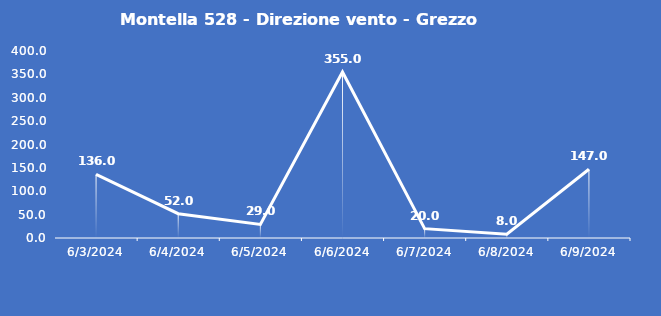
| Category | Montella 528 - Direzione vento - Grezzo (°N) |
|---|---|
| 6/3/24 | 136 |
| 6/4/24 | 52 |
| 6/5/24 | 29 |
| 6/6/24 | 355 |
| 6/7/24 | 20 |
| 6/8/24 | 8 |
| 6/9/24 | 147 |